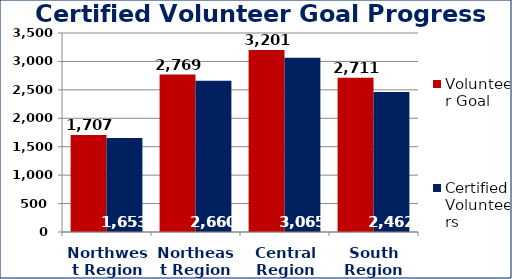
| Category | Volunteer Goal  | Certified Volunteers  |
|---|---|---|
| Northwest Region | 1707 | 1653 |
| Northeast Region | 2769 | 2660 |
| Central Region | 3201 | 3065 |
| South Region | 2711 | 2462 |